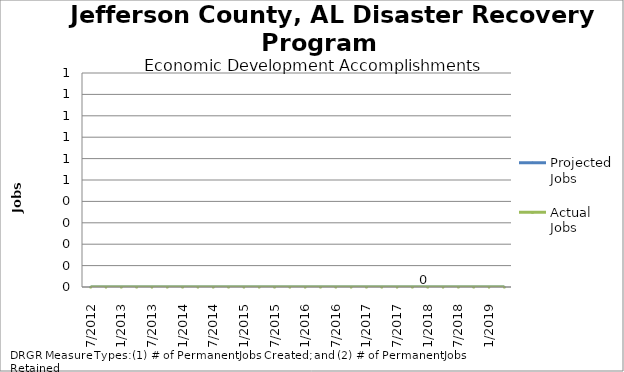
| Category | Projected Jobs | Actual Jobs |
|---|---|---|
| 7/2012 | 0 | 0 |
| 10/2012 | 0 | 0 |
| 1/2013 | 0 | 0 |
| 4/2013 | 0 | 0 |
| 7/2013 | 0 | 0 |
| 10/2013 | 0 | 0 |
| 1/2014 | 0 | 0 |
| 4/2014 | 0 | 0 |
| 7/2014 | 0 | 0 |
| 10/2014 | 0 | 0 |
| 1/2015 | 0 | 0 |
| 4/2015 | 0 | 0 |
| 7/2015 | 0 | 0 |
| 10/2015 | 0 | 0 |
| 1/2016 | 0 | 0 |
| 4/2016 | 0 | 0 |
| 7/2016 | 0 | 0 |
| 10/2016 | 0 | 0 |
| 1/2017 | 0 | 0 |
| 4/2017 | 0 | 0 |
| 7/2017 | 0 | 0 |
| 10/2017 | 0 | 0 |
| 1/2018 | 0 | 0 |
| 4/2018 | 0 | 0 |
| 7/2018 | 0 | 0 |
| 10/2018 | 0 | 0 |
| 1/2019 | 0 | 0 |
| 4/2019 | 0 | 0 |